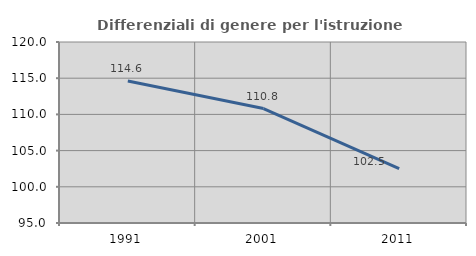
| Category | Differenziali di genere per l'istruzione superiore |
|---|---|
| 1991.0 | 114.61 |
| 2001.0 | 110.814 |
| 2011.0 | 102.496 |